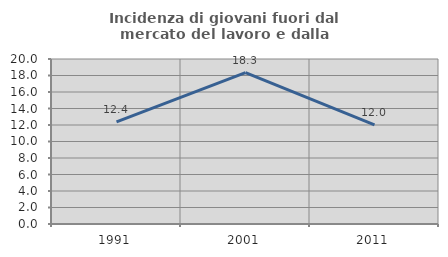
| Category | Incidenza di giovani fuori dal mercato del lavoro e dalla formazione  |
|---|---|
| 1991.0 | 12.376 |
| 2001.0 | 18.344 |
| 2011.0 | 12.003 |